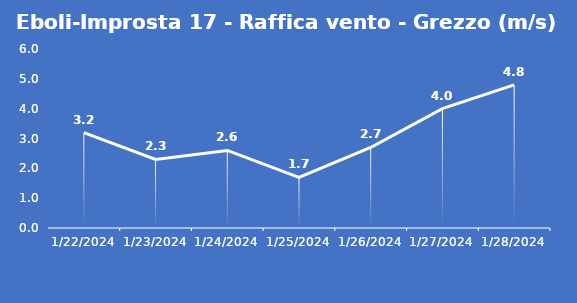
| Category | Eboli-Improsta 17 - Raffica vento - Grezzo (m/s) |
|---|---|
| 1/22/24 | 3.2 |
| 1/23/24 | 2.3 |
| 1/24/24 | 2.6 |
| 1/25/24 | 1.7 |
| 1/26/24 | 2.7 |
| 1/27/24 | 4 |
| 1/28/24 | 4.8 |